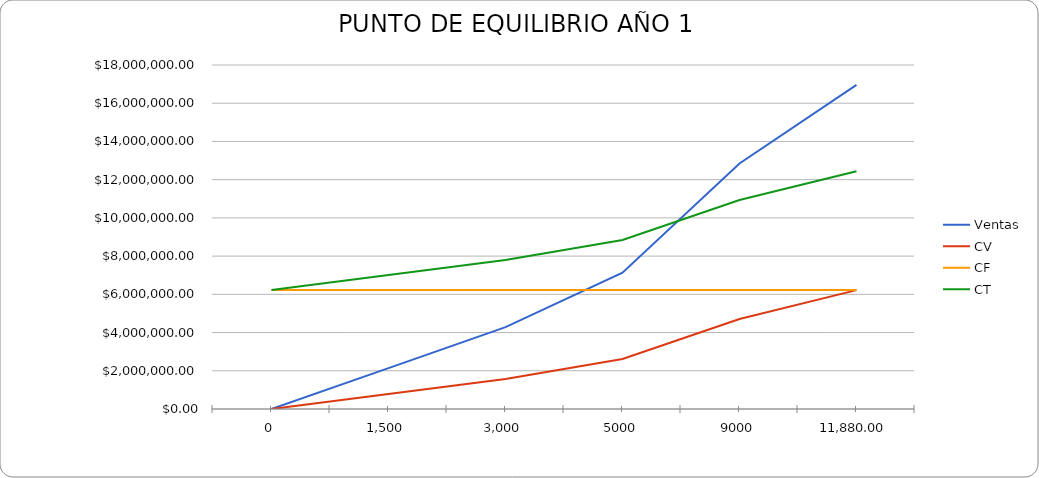
| Category | Ventas | CV | CF | CT |
|---|---|---|---|---|
| 0.0 | 0 | 0 | 6224128.362 | 6224128.362 |
| 1500.0 | 2140909.091 | 785356.39 | 6224128.362 | 7009484.751 |
| 3000.0 | 4281818.182 | 1570712.779 | 6224128.362 | 7794841.141 |
| 5000.0 | 7136363.636 | 2617854.632 | 6224128.362 | 8841982.994 |
| 9000.0 | 12845454.545 | 4712138.338 | 6224128.362 | 10936266.7 |
| 11880.0 | 16956000 | 6220022.607 | 6224128.362 | 12444150.968 |